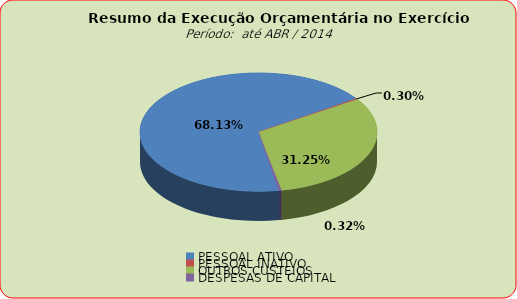
| Category | Series 0 |
|---|---|
| PESSOAL ATIVO | 38474929.48 |
| PESSOAL INATIVO | 171682.95 |
| OUTROS CUSTEIOS | 17646393.63 |
| DESPESAS DE CAPITAL | 179056.75 |